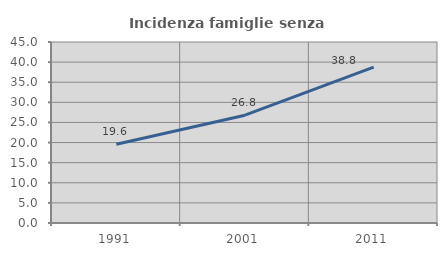
| Category | Incidenza famiglie senza nuclei |
|---|---|
| 1991.0 | 19.563 |
| 2001.0 | 26.808 |
| 2011.0 | 38.769 |